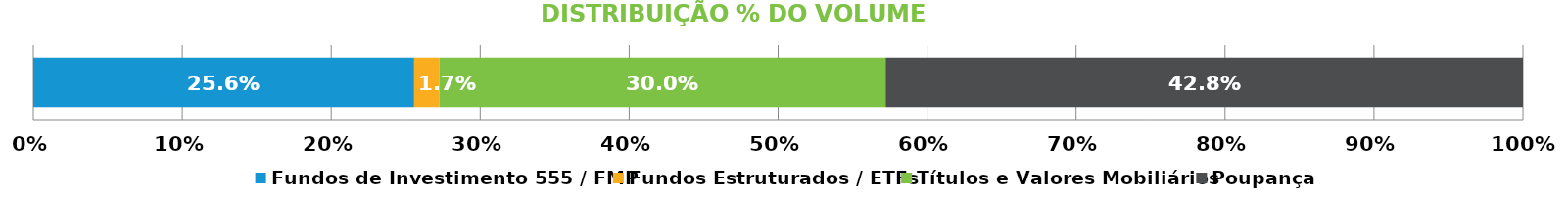
| Category | Fundos de Investimento 555 / FMP | Fundos Estruturados / ETFs | Títulos e Valores Mobiliários | Poupança |
|---|---|---|---|---|
| 0 | 0.256 | 0.017 | 0.3 | 0.428 |